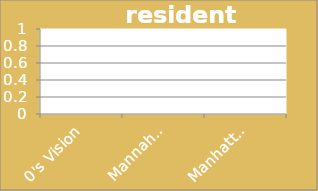
| Category | residents |
|---|---|
| 0's Vision | 0 |
| Mannahatta (1609) | 0 |
| Manhattan (2010) | 0 |